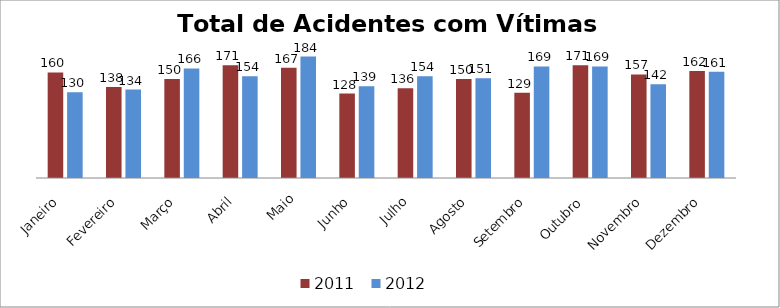
| Category | 2011 | 2012  |
|---|---|---|
| Janeiro | 160 | 130 |
| Fevereiro | 138 | 134 |
| Março | 150 | 166 |
| Abril | 171 | 154 |
| Maio | 167 | 184 |
| Junho | 128 | 139 |
| Julho | 136 | 154 |
| Agosto | 150 | 151 |
| Setembro | 129 | 169 |
| Outubro | 171 | 169 |
| Novembro | 157 | 142 |
| Dezembro | 162 | 161 |